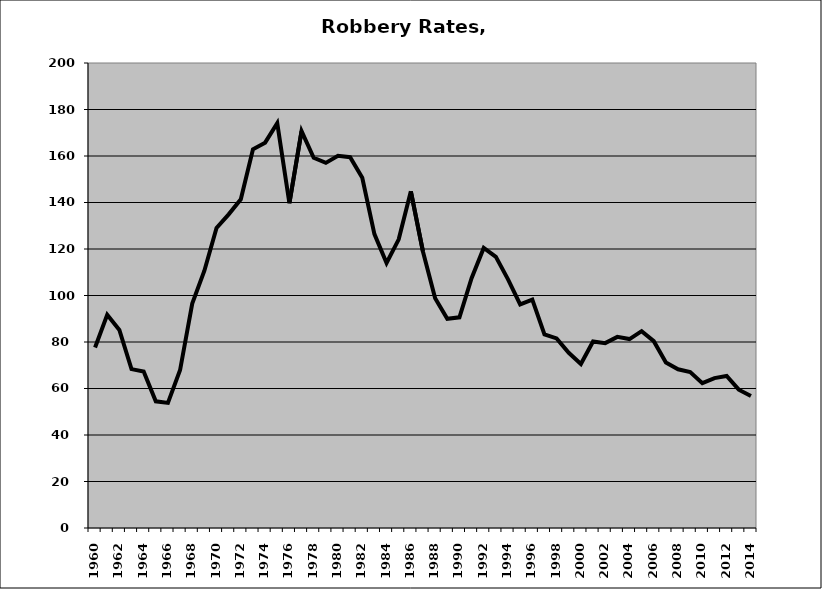
| Category | Robbery |
|---|---|
| 1960.0 | 77.653 |
| 1961.0 | 91.69 |
| 1962.0 | 85.16 |
| 1963.0 | 68.332 |
| 1964.0 | 67.294 |
| 1965.0 | 54.495 |
| 1966.0 | 53.819 |
| 1967.0 | 67.949 |
| 1968.0 | 96.533 |
| 1969.0 | 110.667 |
| 1970.0 | 129.074 |
| 1971.0 | 134.91 |
| 1972.0 | 141.366 |
| 1973.0 | 162.905 |
| 1974.0 | 165.745 |
| 1975.0 | 174.112 |
| 1976.0 | 139.683 |
| 1977.0 | 170.714 |
| 1978.0 | 159.213 |
| 1979.0 | 157.035 |
| 1980.0 | 160.089 |
| 1981.0 | 159.501 |
| 1982.0 | 150.64 |
| 1983.0 | 126.41 |
| 1984.0 | 114.003 |
| 1985.0 | 124.172 |
| 1986.0 | 144.812 |
| 1987.0 | 118.811 |
| 1988.0 | 98.784 |
| 1989.0 | 89.961 |
| 1990.0 | 90.608 |
| 1991.0 | 107.433 |
| 1992.0 | 120.461 |
| 1993.0 | 116.657 |
| 1994.0 | 106.947 |
| 1995.0 | 96.184 |
| 1996.0 | 98.221 |
| 1997.0 | 83.278 |
| 1998.0 | 81.541 |
| 1999.0 | 75.343 |
| 2000.0 | 70.537 |
| 2001.0 | 80.23 |
| 2002.0 | 79.515 |
| 2003.0 | 82.197 |
| 2004.0 | 81.25 |
| 2005.0 | 84.661 |
| 2006.0 | 80.364 |
| 2007.0 | 71.192 |
| 2008.0 | 68.265 |
| 2009.0 | 67.088 |
| 2010.0 | 62.276 |
| 2011.0 | 64.48 |
| 2012.0 | 65.363 |
| 2013.0 | 59.483 |
| 2014.0 | 56.742 |